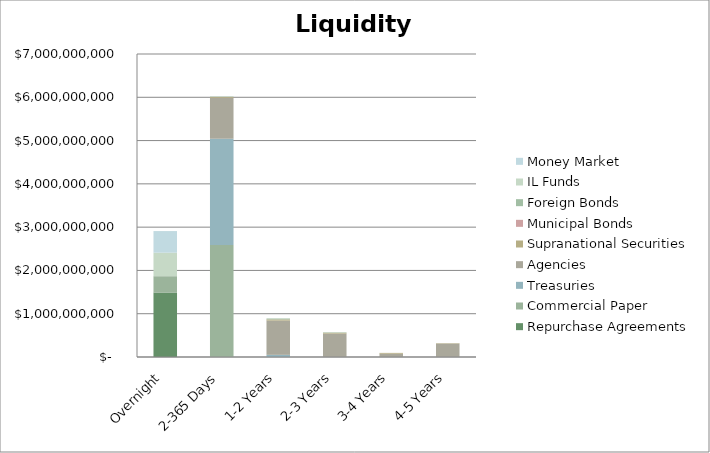
| Category | Repurchase Agreements | Commercial Paper | Treasuries | Agencies | Supranational Securities | Municipal Bonds | Foreign Bonds | IL Funds | Money Market |
|---|---|---|---|---|---|---|---|---|---|
| Overnight | 1490225000 | 376300000 | 0 | 0 | 0 | 0 | 0 | 543000000 | 500000000 |
| 2-365 Days | 0 | 2590000000 | 2450000000 | 946002000 | 20000000 | 0 | 10000000 | 0 | 0 |
| 1-2 Years | 0 | 0 | 50000000 | 790001000 | 30000000 | 0 | 20000000 | 0 | 0 |
| 2-3 Years | 0 | 0 | 0 | 540007000 | 20000000 | 0 | 10000000 | 0 | 0 |
| 3-4 Years | 0 | 0 | 0 | 75005000 | 20000000 | 410000 | 0 | 0 | 0 |
| 4-5 Years | 0 | 0 | 0 | 310035000 | 10000000 | 95000 | 0 | 0 | 0 |